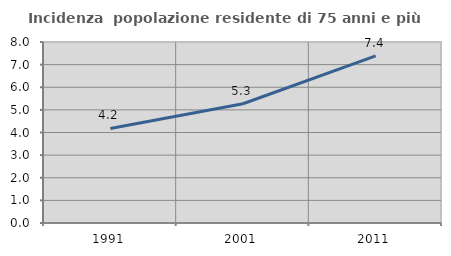
| Category | Incidenza  popolazione residente di 75 anni e più |
|---|---|
| 1991.0 | 4.179 |
| 2001.0 | 5.271 |
| 2011.0 | 7.388 |